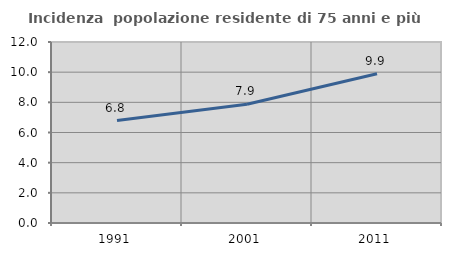
| Category | Incidenza  popolazione residente di 75 anni e più |
|---|---|
| 1991.0 | 6.792 |
| 2001.0 | 7.868 |
| 2011.0 | 9.898 |